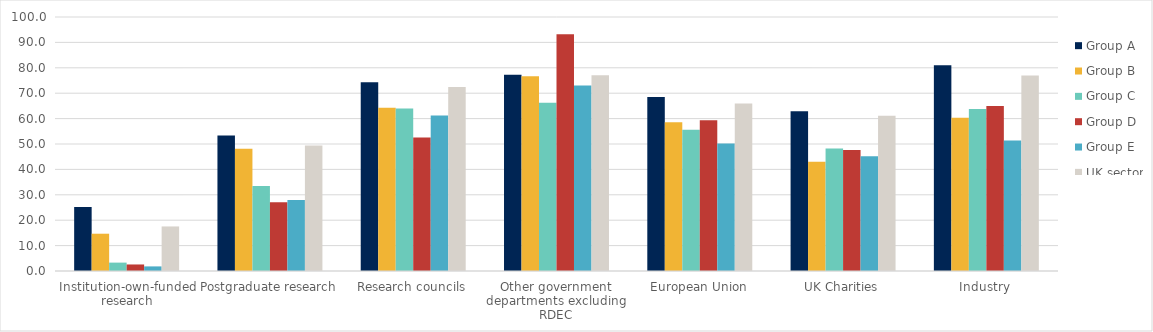
| Category | Group A | Group B | Group C | Group D | Group E | UK sector |
|---|---|---|---|---|---|---|
| Institution-own-funded research | 25.169 | 14.681 | 3.3 | 2.569 | 1.811 | 17.54 |
| Postgraduate research | 53.299 | 48.104 | 33.462 | 27.045 | 27.984 | 49.423 |
| Research councils | 74.306 | 64.304 | 64.001 | 52.521 | 61.207 | 72.426 |
| Other government departments excluding RDEC | 77.283 | 76.71 | 66.203 | 93.195 | 73.018 | 77.06 |
| European Union | 68.544 | 58.53 | 55.568 | 59.396 | 50.186 | 65.914 |
| UK Charities | 62.888 | 42.994 | 48.214 | 47.623 | 45.198 | 61.15 |
| Industry | 81.016 | 60.333 | 63.731 | 65.005 | 51.407 | 77.015 |